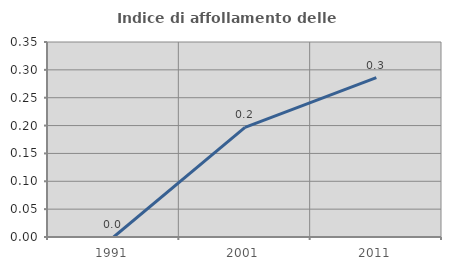
| Category | Indice di affollamento delle abitazioni  |
|---|---|
| 1991.0 | 0 |
| 2001.0 | 0.197 |
| 2011.0 | 0.286 |